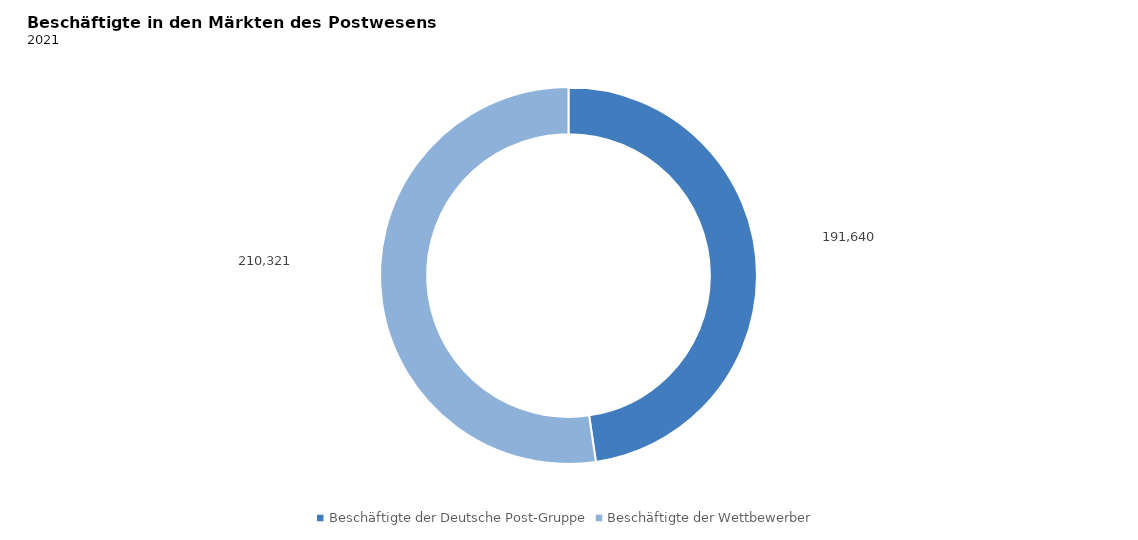
| Category | Beschäftigte der Deutsche Post-Gruppe |
|---|---|
| Beschäftigte der Deutsche Post-Gruppe | 191640 |
| Beschäftigte der Wettbewerber | 210321 |